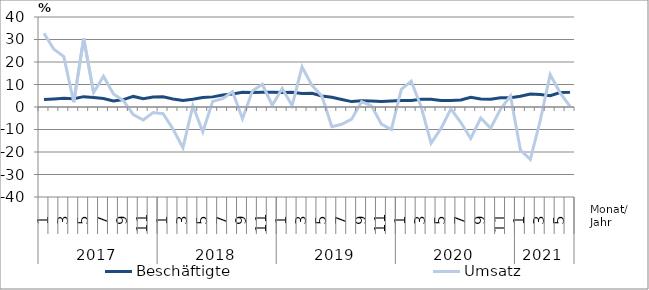
| Category | Beschäftigte | Umsatz |
|---|---|---|
| 0 | 3.3 | 32.8 |
| 1 | 3.6 | 25.7 |
| 2 | 3.9 | 22.4 |
| 3 | 3.7 | 2.1 |
| 4 | 4.6 | 30.4 |
| 5 | 4.2 | 6.4 |
| 6 | 3.8 | 13.7 |
| 7 | 2.7 | 5.8 |
| 8 | 3.3 | 2.8 |
| 9 | 4.7 | -3.4 |
| 10 | 3.7 | -5.8 |
| 11 | 4.4 | -2.5 |
| 12 | 4.5 | -3 |
| 13 | 3.6 | -9.8 |
| 14 | 2.9 | -18.1 |
| 15 | 3.4 | 0.5 |
| 16 | 4.2 | -11 |
| 17 | 4.5 | 2.5 |
| 18 | 5.3 | 3.7 |
| 19 | 5.8 | 6.8 |
| 20 | 6.6 | -5.2 |
| 21 | 6.5 | 7.1 |
| 22 | 6.6 | 10.1 |
| 23 | 6.6 | 0.8 |
| 24 | 6.4 | 8.2 |
| 25 | 6.5 | 0.6 |
| 26 | 6 | 17.8 |
| 27 | 6.1 | 9.6 |
| 28 | 4.9 | 4.9 |
| 29 | 4.3 | -8.8 |
| 30 | 3.3 | -7.7 |
| 31 | 2.4 | -5.4 |
| 32 | 2.8 | 2.4 |
| 33 | 2.7 | 0.5 |
| 34 | 2.5 | -7.6 |
| 35 | 2.7 | -10 |
| 36 | 2.9 | 7.8 |
| 37 | 2.9 | 11.5 |
| 38 | 3.4 | 0.1 |
| 39 | 3.4 | -16.1 |
| 40 | 2.9 | -9.5 |
| 41 | 2.9 | -0.8 |
| 42 | 3.1 | -6.9 |
| 43 | 4.3 | -14 |
| 44 | 3.6 | -4.9 |
| 45 | 3.4 | -9.4 |
| 46 | 4.1 | -0.9 |
| 47 | 4.1 | 4.9 |
| 48 | 4.8 | -19.1 |
| 49 | 5.8 | -23.3 |
| 50 | 5.6 | -6 |
| 51 | 5 | 14.4 |
| 52 | 6.4 | 6.3 |
| 53 | 6.5 | 0.3 |